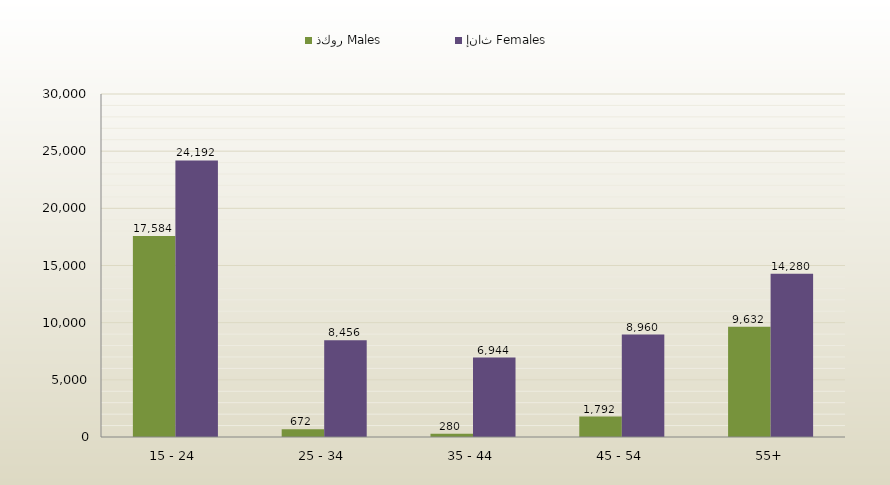
| Category | ذكور Males | إناث Females |
|---|---|---|
| 15 - 24 | 17584 | 24192 |
| 25 - 34 | 672 | 8456 |
| 35 - 44 | 280 | 6944 |
| 45 - 54 | 1792 | 8960 |
| 55+ | 9632 | 14280 |